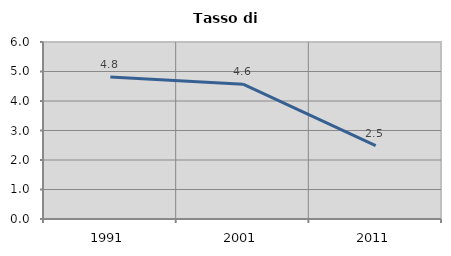
| Category | Tasso di disoccupazione   |
|---|---|
| 1991.0 | 4.813 |
| 2001.0 | 4.569 |
| 2011.0 | 2.484 |